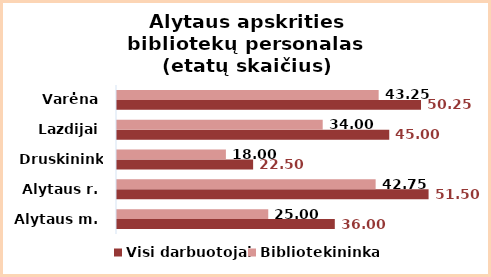
| Category | Visi darbuotojai | Bibliotekininkai |
|---|---|---|
| Alytaus m. | 36 | 25 |
| Alytaus r. | 51.5 | 42.75 |
| Druskininkai | 22.5 | 18 |
| Lazdijai | 45 | 34 |
| Varėna | 50.25 | 43.25 |